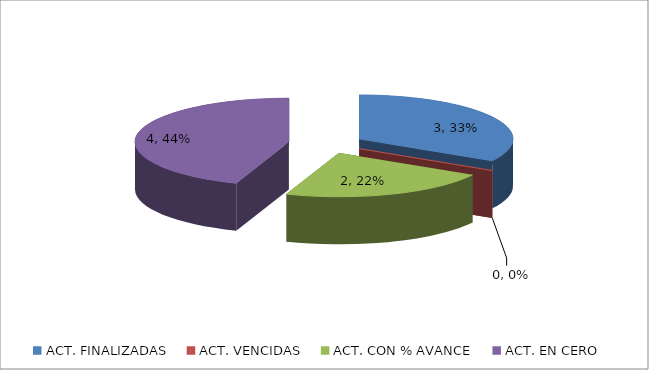
| Category | Series 0 | Series 1 |
|---|---|---|
| ACT. FINALIZADAS | 3 |  |
| ACT. VENCIDAS | 0 |  |
| ACT. CON % AVANCE | 2 |  |
| ACT. EN CERO | 4 |  |